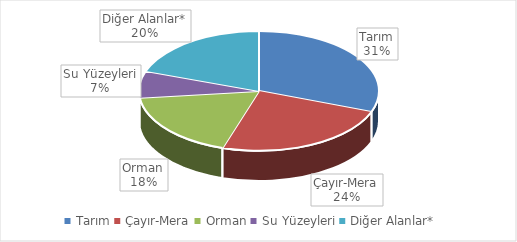
| Category | Series 0 |
|---|---|
| Tarım | 286044 |
| Çayır-Mera | 225306 |
| Orman | 170318 |
| Su Yüzeyleri | 67138 |
| Diğer Alanlar* | 182494 |